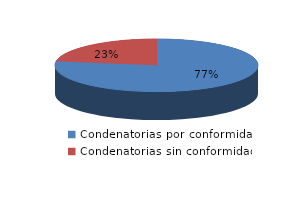
| Category | Series 0 |
|---|---|
| 0 | 576 |
| 1 | 168 |